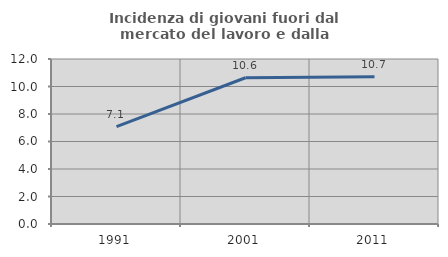
| Category | Incidenza di giovani fuori dal mercato del lavoro e dalla formazione  |
|---|---|
| 1991.0 | 7.087 |
| 2001.0 | 10.638 |
| 2011.0 | 10.714 |